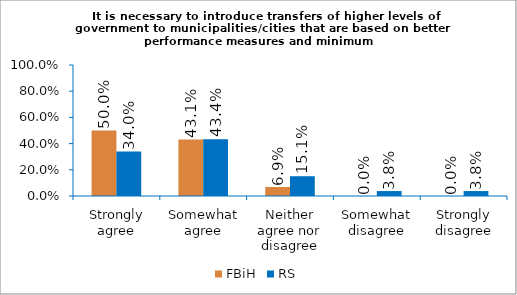
| Category | FBiH | RS |
|---|---|---|
| Strongly agree | 0.5 | 0.34 |
| Somewhat agree | 0.431 | 0.434 |
| Neither agree nor disagree | 0.069 | 0.151 |
| Somewhat disagree | 0 | 0.038 |
| Strongly disagree | 0 | 0.038 |